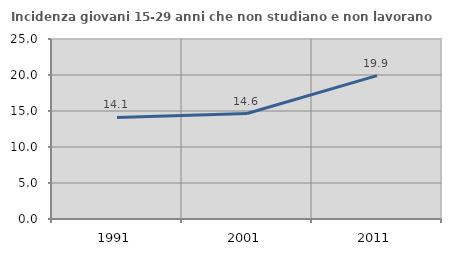
| Category | Incidenza giovani 15-29 anni che non studiano e non lavorano  |
|---|---|
| 1991.0 | 14.103 |
| 2001.0 | 14.644 |
| 2011.0 | 19.905 |